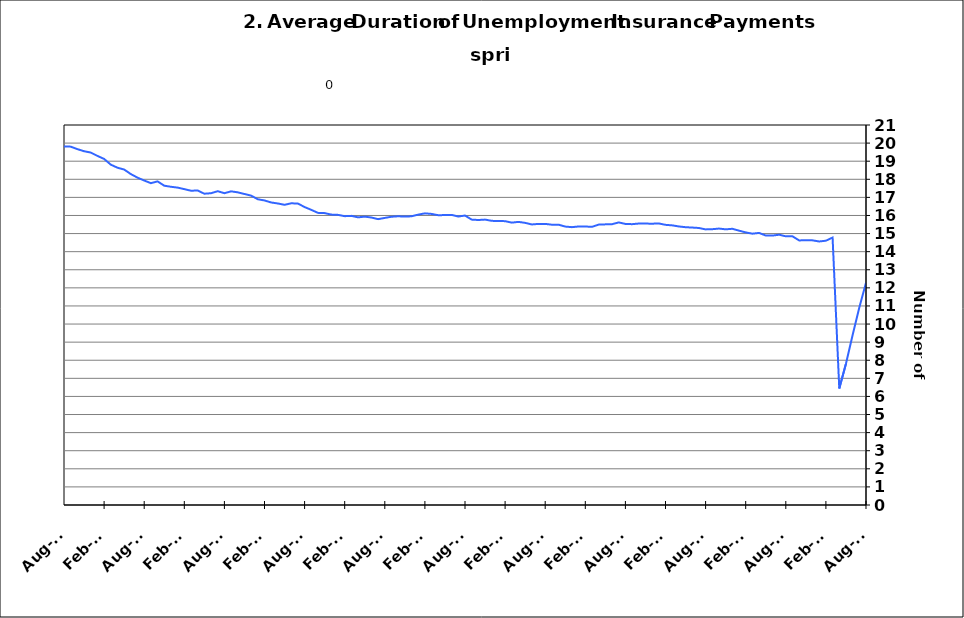
| Category | Average Duration |
|---|---|
| 1995-01-31 | 14.777 |
| 1995-02-28 | 14.761 |
| 1995-03-31 | 14.672 |
| 1995-04-30 | 14.601 |
| 1995-05-31 | 14.598 |
| 1995-06-30 | 14.51 |
| 1995-07-31 | 14.501 |
| 1995-08-31 | 14.41 |
| 1995-09-30 | 14.373 |
| 1995-10-31 | 14.393 |
| 1995-11-30 | 14.306 |
| 1995-12-31 | 14.23 |
| 1996-01-15 | 14.277 |
| 1996-02-15 | 14.204 |
| 1996-03-15 | 14.195 |
| 1996-04-15 | 14.116 |
| 1996-05-15 | 14.187 |
| 1996-06-15 | 14.214 |
| 1996-07-15 | 14.172 |
| 1996-08-15 | 14.174 |
| 1996-09-15 | 14.312 |
| 1996-10-15 | 14.308 |
| 1996-11-15 | 14.344 |
| 1996-12-15 | 14.461 |
| 1997-01-15 | 14.383 |
| 1997-02-15 | 14.413 |
| 1997-03-15 | 14.473 |
| 1997-04-15 | 14.518 |
| 1997-05-31 | 14.455 |
| 1997-06-30 | 14.38 |
| 1997-07-31 | 14.331 |
| 1997-08-31 | 14.279 |
| 1997-09-30 | 14.129 |
| 1997-10-31 | 14.07 |
| 1997-11-30 | 14.067 |
| 1997-12-31 | 13.993 |
| 1998-01-31 | 14.035 |
| 1998-02-28 | 14.047 |
| 1998-03-31 | 13.866 |
| 1998-04-30 | 13.764 |
| 1998-05-31 | 13.76 |
| 1998-06-30 | 13.675 |
| 1998-07-31 | 13.636 |
| 1998-08-31 | 13.558 |
| 1998-09-30 | 13.537 |
| 1998-10-31 | 13.462 |
| 1998-11-30 | 13.294 |
| 1998-12-31 | 13.16 |
| 1999-01-31 | 13.192 |
| 1999-02-28 | 13.297 |
| 1999-03-31 | 13.402 |
| 1999-04-30 | 13.443 |
| 1999-05-31 | 13.587 |
| 1999-06-30 | 13.74 |
| 1999-07-31 | 13.61 |
| 1999-08-31 | 13.717 |
| 1999-09-30 | 13.836 |
| 1999-10-31 | 14.032 |
| 1999-11-30 | 14.175 |
| 1999-12-31 | 14.303 |
| 2000-01-31 | 14.429 |
| 2000-02-29 | 14.376 |
| 2000-03-31 | 14.318 |
| 2000-04-30 | 14.352 |
| 2000-05-31 | 14.265 |
| 2000-06-30 | 14.174 |
| 2000-07-31 | 14.386 |
| 2000-08-31 | 14.362 |
| 2000-09-30 | 14.238 |
| 2000-10-31 | 14.236 |
| 2000-11-30 | 14.118 |
| 2000-12-31 | 14.004 |
| 2001-01-31 | 13.831 |
| 2001-02-28 | 13.708 |
| 2001-03-31 | 13.528 |
| 2001-04-30 | 13.376 |
| 2001-05-31 | 13.219 |
| 2001-06-30 | 13.171 |
| 2001-07-31 | 13.214 |
| 2001-08-31 | 13.157 |
| 2001-09-30 | 13.341 |
| 2001-10-31 | 13.178 |
| 2001-11-30 | 13.143 |
| 2001-12-31 | 13.4 |
| 2002-01-31 | 13.658 |
| 2002-02-28 | 13.952 |
| 2002-03-31 | 14.4 |
| 2002-04-30 | 14.946 |
| 2002-05-31 | 15.299 |
| 2002-06-30 | 15.677 |
| 2002-07-31 | 15.88 |
| 2002-08-31 | 16.087 |
| 2002-09-30 | 16.301 |
| 2002-10-31 | 16.624 |
| 2002-11-30 | 17.004 |
| 2002-12-31 | 17.229 |
| 2003-01-31 | 17.337 |
| 2003-02-28 | 17.359 |
| 2003-03-31 | 17.387 |
| 2003-04-30 | 17.118 |
| 2003-05-31 | 17.133 |
| 2003-06-30 | 17.187 |
| 2003-07-31 | 17.249 |
| 2003-08-31 | 17.486 |
| 2003-09-30 | 17.575 |
| 2003-10-31 | 17.651 |
| 2003-11-30 | 17.867 |
| 2003-12-31 | 17.897 |
| 2004-01-31 | 17.88 |
| 2004-02-29 | 17.995 |
| 2004-03-31 | 17.897 |
| 2004-04-30 | 17.828 |
| 2004-05-31 | 17.883 |
| 2004-06-30 | 17.577 |
| 2004-07-31 | 17.405 |
| 2004-08-31 | 17.207 |
| 2004-09-30 | 16.913 |
| 2004-10-31 | 16.869 |
| 2004-11-30 | 16.518 |
| 2004-12-31 | 16.342 |
| 2005-01-31 | 16.376 |
| 2005-02-28 | 16.223 |
| 2005-03-31 | 16.07 |
| 2005-04-30 | 15.951 |
| 2005-05-31 | 15.826 |
| 2005-06-30 | 15.815 |
| 2005-07-31 | 15.99 |
| 2005-08-31 | 15.796 |
| 2005-09-30 | 15.736 |
| 2005-10-31 | 15.703 |
| 2005-11-30 | 15.697 |
| 2005-12-31 | 15.583 |
| 2006-01-31 | 15.497 |
| 2006-02-28 | 15.415 |
| 2006-03-31 | 15.399 |
| 2006-04-30 | 15.663 |
| 2006-05-31 | 15.487 |
| 2006-06-30 | 15.333 |
| 2006-07-31 | 15.144 |
| 2006-08-31 | 14.91 |
| 2006-09-30 | 14.845 |
| 2006-10-31 | 14.766 |
| 2006-11-30 | 14.588 |
| 2006-12-31 | 14.585 |
| 2007-01-31 | 14.485 |
| 2007-02-28 | 14.412 |
| 2007-03-31 | 14.336 |
| 2007-04-30 | 14.26 |
| 2007-05-31 | 14.261 |
| 2007-06-30 | 14.479 |
| 2007-07-30 | 14.599 |
| 2007-08-31 | 14.843 |
| 2007-09-30 | 14.99 |
| 2007-10-31 | 15.008 |
| 2007-11-15 | 15.072 |
| 2007-12-15 09:36:00 | 15.095 |
| 2008-01-14 19:12:00 | 15.068 |
| 2008-02-14 04:48:00 | 15.026 |
| 2008-03-15 14:24:00 | 15.176 |
| 2008-04-15 | 15.005 |
| 2008-05-15 09:36:00 | 15.047 |
| 2008-06-14 19:12:00 | 15.073 |
| 2008-07-15 04:48:00 | 15.03 |
| 2008-08-14 14:24:00 | 15.17 |
| 2008-09-14 | 15.292 |
| 2008-10-14 09:36:00 | 15.161 |
| 2008-11-13 19:12:00 | 14.99 |
| 2008-12-14 04:48:00 | 14.905 |
| 2009-01-13 14:24:00 | 14.874 |
| 2009-02-13 | 14.935 |
| 2009-03-15 09:36:00 | 15.173 |
| 2009-04-14 19:12:00 | 15.519 |
| 2009-05-15 04:48:00 | 15.914 |
| 2009-06-14 14:24:00 | 16.348 |
| 2009-07-15 | 16.557 |
| 2009-08-14 09:36:00 | 16.984 |
| 2009-09-13 19:12:00 | 17.215 |
| 2009-10-14 04:48:00 | 17.535 |
| 2009-11-13 14:24:00 | 18.106 |
| 2009-12-14 | 18.54 |
| 2010-01-13 09:36:00 | 18.944 |
| 2010-02-12 19:12:00 | 19.336 |
| 2010-03-15 04:48:00 | 19.768 |
| 2010-04-14 14:24:00 | 19.926 |
| 2010-05-15 | 19.977 |
| 2010-06-14 09:36:00 | 19.94 |
| 2010-07-14 19:12:00 | 19.962 |
| 2010-08-14 04:48:00 | 19.819 |
| 2010-09-13 14:24:00 | 19.804 |
| 2010-10-14 | 19.667 |
| 2010-11-13 09:36:00 | 19.551 |
| 2010-12-13 19:12:00 | 19.477 |
| 2011-01-13 04:48:00 | 19.292 |
| 2011-02-12 14:24:00 | 19.125 |
| 2011-03-15 | 18.81 |
| 2011-04-14 09:36:00 | 18.639 |
| 2011-05-14 19:12:00 | 18.54 |
| 2011-06-14 04:48:00 | 18.288 |
| 2011-07-14 14:24:00 | 18.091 |
| 2011-08-14 | 17.932 |
| 2011-09-13 09:36:00 | 17.786 |
| 2011-10-13 19:12:00 | 17.884 |
| 2011-11-13 04:48:00 | 17.646 |
| 2011-12-13 14:24:00 | 17.586 |
| 2012-01-13 | 17.54 |
| 2012-02-12 09:36:00 | 17.456 |
| 2012-03-13 19:12:00 | 17.368 |
| 2012-04-13 04:48:00 | 17.381 |
| 2012-05-13 14:24:00 | 17.203 |
| 2012-06-13 | 17.23 |
| 2012-07-13 09:36:00 | 17.342 |
| 2012-08-12 19:12:00 | 17.231 |
| 2012-09-12 04:48:00 | 17.333 |
| 2012-10-12 14:24:00 | 17.279 |
| 2012-11-12 | 17.187 |
| 2012-12-12 09:36:00 | 17.098 |
| 2013-01-11 19:12:00 | 16.896 |
| 2013-02-11 04:48:00 | 16.83 |
| 2013-03-13 14:24:00 | 16.718 |
| 2013-04-13 | 16.663 |
| 2013-05-13 09:36:00 | 16.59 |
| 2013-06-12 19:12:00 | 16.673 |
| 2013-07-13 04:48:00 | 16.659 |
| 2013-08-12 14:24:00 | 16.466 |
| 2013-09-12 | 16.311 |
| 2013-10-12 09:36:00 | 16.144 |
| 2013-11-11 19:12:00 | 16.13 |
| 2013-12-12 04:48:00 | 16.048 |
| 2014-01-11 14:24:00 | 16.033 |
| 2014-02-11 | 15.962 |
| 2014-03-13 09:36:00 | 15.979 |
| 2014-04-12 19:12:00 | 15.897 |
| 2014-05-13 04:48:00 | 15.936 |
| 2014-06-12 14:24:00 | 15.888 |
| 2014-07-13 | 15.797 |
| 2014-08-12 09:36:00 | 15.865 |
| 2014-09-11 19:12:00 | 15.93 |
| 2014-10-12 04:48:00 | 15.956 |
| 2014-11-11 14:24:00 | 15.939 |
| 2014-12-12 | 15.955 |
| 2015-01-11 09:36:00 | 16.046 |
| 2015-02-10 19:12:00 | 16.117 |
| 2015-03-13 04:48:00 | 16.086 |
| 2015-04-12 14:24:00 | 16.014 |
| 2015-05-13 | 16.023 |
| 2015-06-12 09:36:00 | 16.033 |
| 2015-07-12 19:12:00 | 15.941 |
| 2015-08-12 04:48:00 | 15.997 |
| 2015-09-11 14:24:00 | 15.772 |
| 2015-10-12 | 15.749 |
| 2015-11-11 09:36:00 | 15.773 |
| 2015-12-11 19:12:00 | 15.704 |
| 2016-01-11 04:48:00 | 15.692 |
| 2016-02-10 14:24:00 | 15.687 |
| 2016-03-12 | 15.604 |
| 2016-04-11 09:36:00 | 15.646 |
| 2016-05-11 19:12:00 | 15.592 |
| 2016-06-11 04:48:00 | 15.504 |
| 2016-07-11 14:24:00 | 15.535 |
| 2016-08-11 | 15.535 |
| 2016-09-10 09:36:00 | 15.49 |
| 2016-10-10 19:12:00 | 15.491 |
| 2016-11-10 04:48:00 | 15.386 |
| 2016-12-10 14:24:00 | 15.355 |
| 2017-01-10 | 15.392 |
| 2017-02-09 09:36:00 | 15.391 |
| 2017-03-11 19:12:00 | 15.372 |
| 2017-04-11 04:48:00 | 15.495 |
| 2017-05-11 14:24:00 | 15.509 |
| 2017-06-11 | 15.518 |
| 2017-07-11 09:36:00 | 15.616 |
| 2017-08-10 19:12:00 | 15.534 |
| 2017-09-10 04:48:00 | 15.52 |
| 2017-10-10 14:24:00 | 15.554 |
| 2017-11-10 | 15.552 |
| 2017-12-10 09:36:00 | 15.547 |
| 2018-01-09 19:12:00 | 15.558 |
| 2018-02-09 04:48:00 | 15.483 |
| 2018-03-11 14:24:00 | 15.454 |
| 2018-04-11 | 15.393 |
| 2018-05-11 09:36:00 | 15.352 |
| 2018-06-10 19:12:00 | 15.333 |
| 2018-07-11 04:48:00 | 15.308 |
| 2018-08-10 14:24:00 | 15.231 |
| 2018-09-10 | 15.241 |
| 2018-10-10 09:36:00 | 15.277 |
| 2018-11-09 19:12:00 | 15.234 |
| 2018-12-10 04:48:00 | 15.264 |
| 2019-01-09 14:24:00 | 15.161 |
| 2019-02-09 | 15.064 |
| 2019-03-11 09:36:00 | 14.995 |
| 2019-04-10 19:12:00 | 15.036 |
| 2019-05-11 04:48:00 | 14.892 |
| 2019-06-10 14:24:00 | 14.889 |
| 2019-07-11 | 14.937 |
| 2019-08-10 09:36:00 | 14.848 |
| 2019-09-09 19:12:00 | 14.848 |
| 2019-10-10 04:48:00 | 14.621 |
| 2019-11-09 14:24:00 | 14.633 |
| 2019-12-10 | 14.625 |
| 2020-01-09 09:36:00 | 14.564 |
| 2020-02-08 19:12:00 | 14.605 |
| 2020-03-10 04:48:00 | 14.78 |
| 2020-04-09 14:24:00 | 6.442 |
| 2020-05-10 | 7.803 |
| 2020-06-09 09:36:00 | 9.393 |
| 2020-07-09 19:12:00 | 10.916 |
| 2020-08-09 04:48:00 | 12.288 |